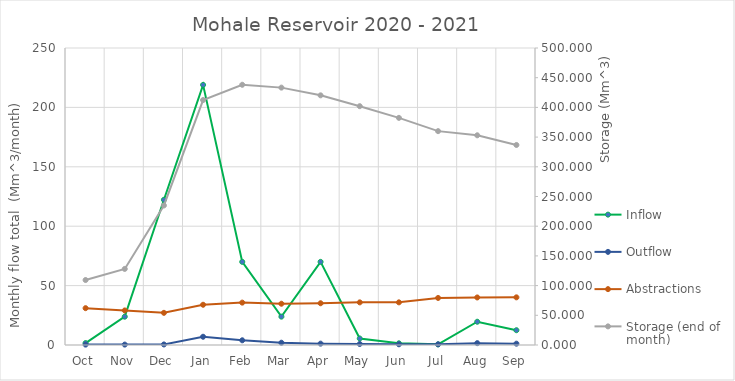
| Category | Inflow | Outflow |
|---|---|---|
| Oct | 1.621 | 0.333 |
| Nov | 23.834 | 0.348 |
| Dec | 122.226 | 0.456 |
| Jan | 218.961 | 6.944 |
| Feb | 69.983 | 3.961 |
| Mar | 23.869 | 1.926 |
| Apr | 69.983 | 1.148 |
| May | 5.459 | 0.839 |
| Jun | 1.418 | 0.592 |
| Jul | 0.539 | 0.576 |
| Aug | 19.577 | 1.556 |
| Sep | 12.441 | 1.113 |